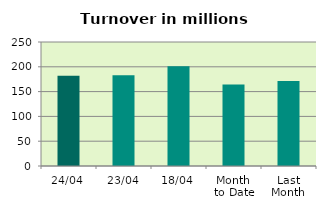
| Category | Series 0 |
|---|---|
| 24/04 | 181.943 |
| 23/04 | 183.178 |
| 18/04 | 200.917 |
| Month 
to Date | 164.453 |
| Last
Month | 171.15 |